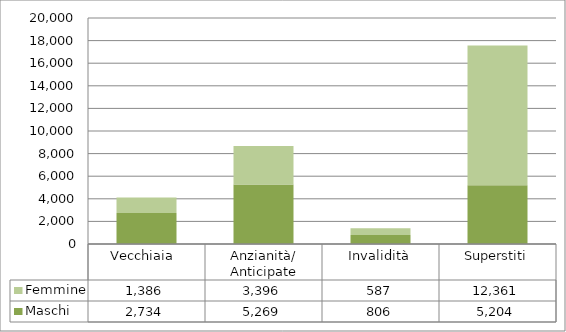
| Category | Maschi | Femmine |
|---|---|---|
| Vecchiaia  | 2734 | 1386 |
| Anzianità/ Anticipate | 5269 | 3396 |
| Invalidità | 806 | 587 |
| Superstiti | 5204 | 12361 |